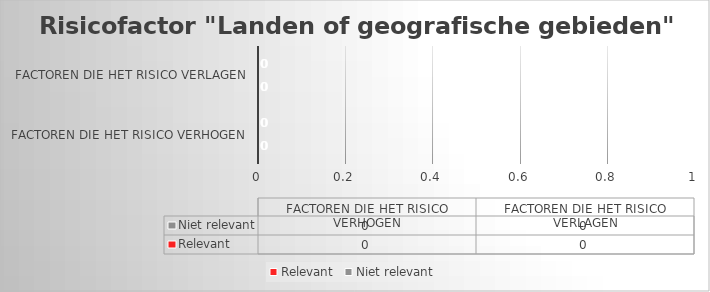
| Category | Relevant | Niet relevant |
|---|---|---|
| FACTOREN DIE HET RISICO VERHOGEN | 0 | 0 |
| FACTOREN DIE HET RISICO VERLAGEN | 0 | 0 |